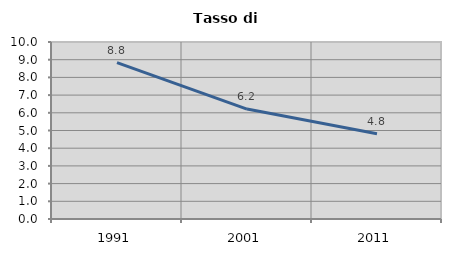
| Category | Tasso di disoccupazione   |
|---|---|
| 1991.0 | 8.835 |
| 2001.0 | 6.212 |
| 2011.0 | 4.821 |